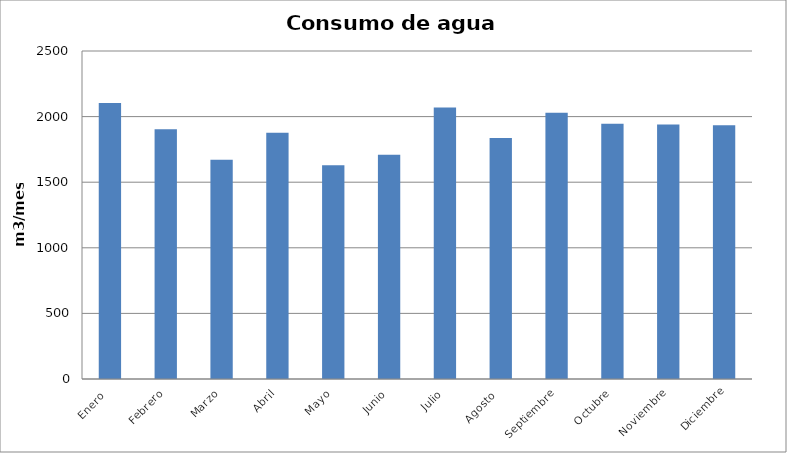
| Category | Series 0 |
|---|---|
| Enero  | 2104 |
| Febrero | 1904 |
| Marzo | 1672 |
| Abril | 1876 |
| Mayo | 1629 |
| Junio | 1710 |
| Julio | 2069 |
| Agosto  | 1837 |
| Septiembre | 2030 |
| Octubre | 1945 |
| Noviembre | 1939 |
| Diciembre | 1935 |